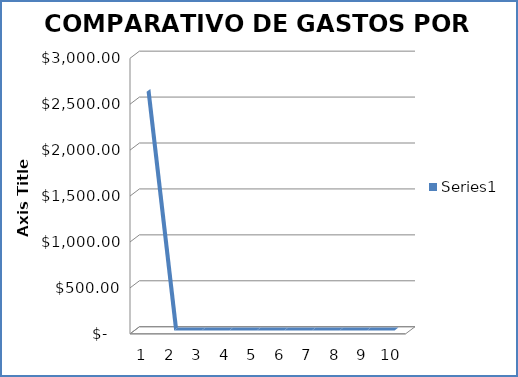
| Category | Series 0 |
|---|---|
| 0 | 2598.28 |
| 1 | 0 |
| 2 | 0 |
| 3 | 0 |
| 4 | 0 |
| 5 | 0 |
| 6 | 0 |
| 7 | 0 |
| 8 | 0 |
| 9 | 0 |